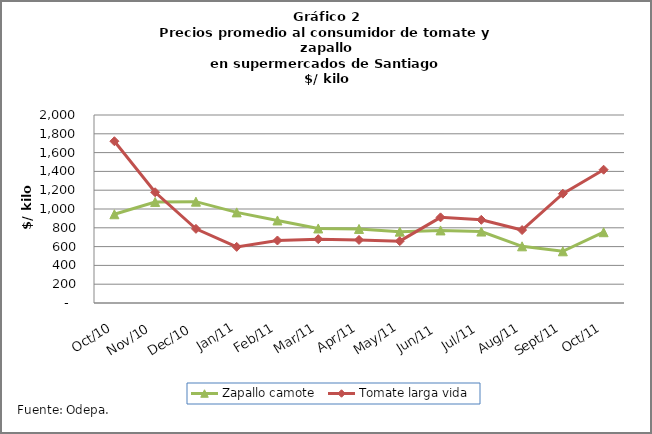
| Category | Zapallo camote | Tomate larga vida |
|---|---|---|
| 2010-10-01 | 944 | 1721 |
| 2010-11-01 | 1075 | 1178 |
| 2010-12-01 | 1078 | 789 |
| 2011-01-01 | 964 | 597 |
| 2011-02-01 | 878 | 665 |
| 2011-03-01 | 793 | 679 |
| 2011-04-01 | 788 | 671 |
| 2011-05-01 | 759 | 658 |
| 2011-06-01 | 772 | 911 |
| 2011-07-01 | 760 | 885 |
| 2011-08-01 | 603 | 776 |
| 2011-09-01 | 550 | 1163 |
| 2011-10-01 | 753 | 1418 |